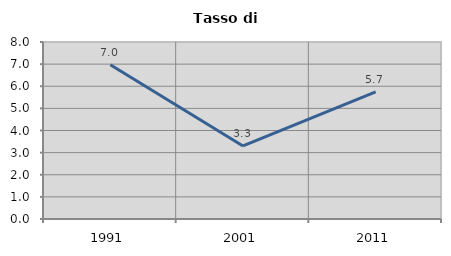
| Category | Tasso di disoccupazione   |
|---|---|
| 1991.0 | 6.971 |
| 2001.0 | 3.3 |
| 2011.0 | 5.748 |